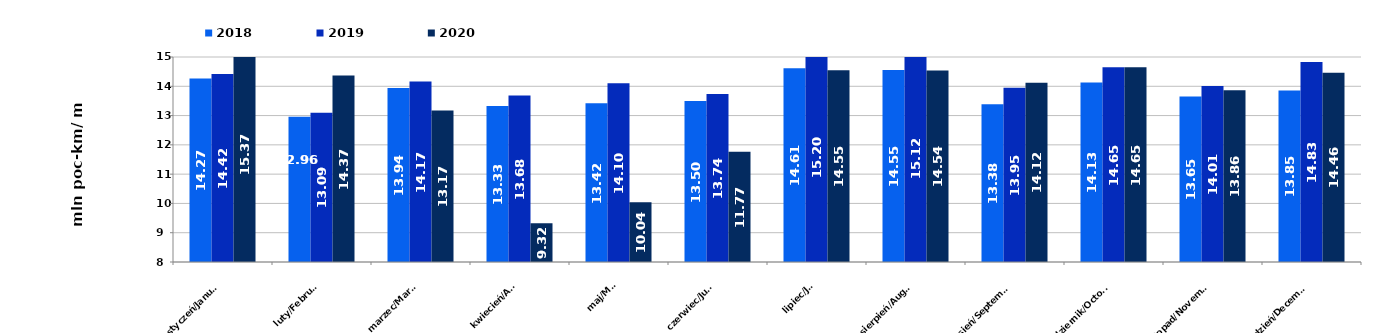
| Category | 2018 | 2019 | 2020 |
|---|---|---|---|
| styczeń/January | 14.267 | 14.42 | 15.367 |
| luty/February | 12.958 | 13.094 | 14.368 |
| marzec/March | 13.945 | 14.167 | 13.172 |
| kwiecień/April | 13.33 | 13.685 | 9.323 |
| maj/May | 13.421 | 14.104 | 10.038 |
| czerwiec/June | 13.497 | 13.738 | 11.768 |
| lipiec/July | 14.614 | 15.204 | 14.551 |
| sierpień/August | 14.553 | 15.119 | 14.537 |
| wrzesień/September | 13.383 | 13.947 | 14.122 |
| październik/October | 14.133 | 14.65 | 14.646 |
| listopad/November | 13.651 | 14.013 | 13.861 |
| grudzień/December | 13.852 | 14.828 | 14.46 |